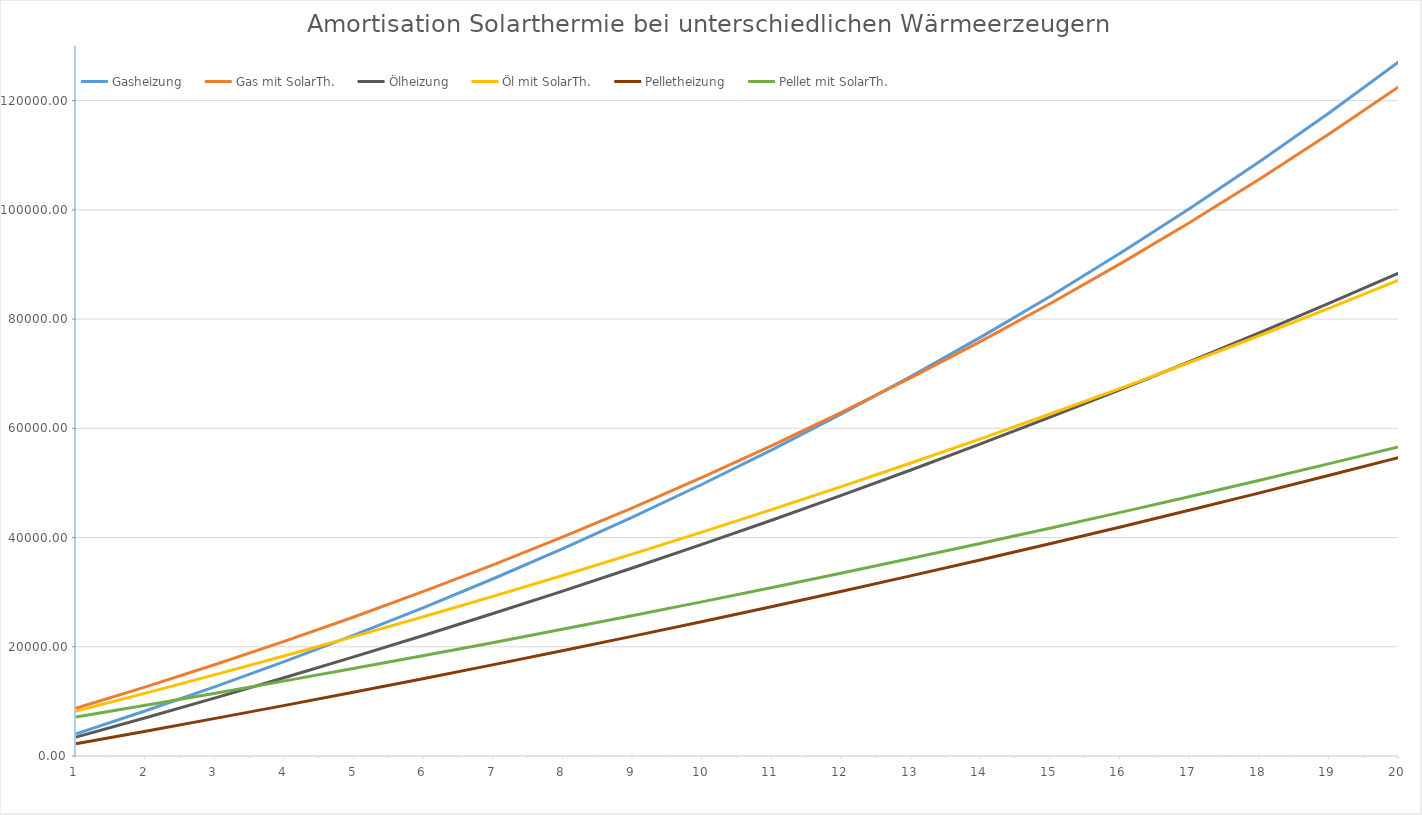
| Category | Gasheizung | Gas mit SolarTh. | Ölheizung | Öl mit SolarTh. | Pelletheizung | Pellet mit SolarTh. |
|---|---|---|---|---|---|---|
| 0 | 4053 | 8747.7 | 3462 | 8215.8 | 2250 | 7125 |
| 1 | 8288.385 | 12664.046 | 7010.55 | 11511.995 | 4545 | 9292.5 |
| 2 | 12714.362 | 16756.629 | 10647.814 | 14890.595 | 6885.9 | 11503.35 |
| 3 | 17339.509 | 21033.377 | 14376.009 | 18353.66 | 9273.618 | 13758.417 |
| 4 | 22172.787 | 25502.579 | 18197.409 | 21903.301 | 11709.09 | 16058.585 |
| 5 | 27223.562 | 30172.895 | 22114.345 | 25541.684 | 14193.272 | 18404.757 |
| 6 | 32501.622 | 35053.375 | 26129.203 | 29271.026 | 16727.138 | 20797.852 |
| 7 | 38017.195 | 40153.477 | 30244.433 | 33093.602 | 19311.68 | 23238.809 |
| 8 | 43780.969 | 45483.084 | 34462.544 | 37011.742 | 21947.914 | 25728.585 |
| 9 | 49804.113 | 51052.522 | 38786.108 | 41027.835 | 24636.872 | 28268.157 |
| 10 | 56098.298 | 56872.586 | 43217.76 | 45144.331 | 27379.61 | 30858.52 |
| 11 | 62675.721 | 62954.552 | 47760.204 | 49363.739 | 30177.202 | 33500.691 |
| 12 | 69549.128 | 69310.207 | 52416.209 | 53688.633 | 33030.746 | 36195.704 |
| 13 | 76731.839 | 75951.866 | 57188.615 | 58121.649 | 35941.361 | 38944.619 |
| 14 | 84237.772 | 82892.4 | 62080.33 | 62665.49 | 38910.188 | 41748.511 |
| 15 | 92081.472 | 90145.258 | 67094.338 | 67322.927 | 41938.392 | 44608.481 |
| 16 | 100278.138 | 97724.495 | 72233.697 | 72096.8 | 45027.16 | 47525.651 |
| 17 | 108843.654 | 105644.797 | 77501.539 | 76990.02 | 48177.703 | 50501.164 |
| 18 | 117794.619 | 113921.513 | 82901.078 | 82005.571 | 51391.257 | 53536.187 |
| 19 | 127148.377 | 122570.681 | 88435.605 | 87146.51 | 54669.082 | 56631.911 |